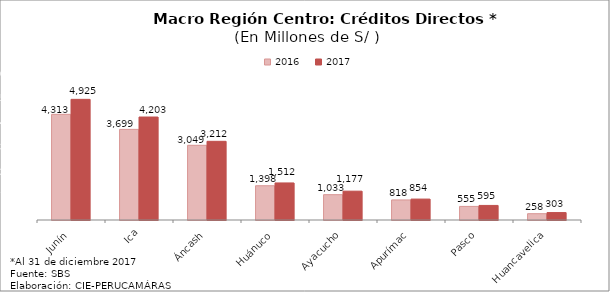
| Category | 2016 | 2017 |
|---|---|---|
| Junín | 4312.868 | 4924.684 |
| Ica | 3698.507 | 4203.383 |
| Áncash | 3049.057 | 3211.686 |
| Huánuco | 1398.017 | 1512.152 |
| Ayacucho | 1033.449 | 1176.833 |
| Apurímac | 818.385 | 853.669 |
| Pasco | 554.522 | 594.825 |
| Huancavelica | 257.509 | 303.135 |